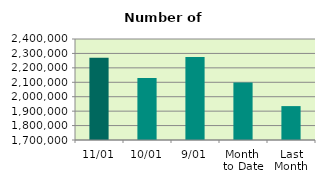
| Category | Series 0 |
|---|---|
| 11/01 | 2269744 |
| 10/01 | 2129860 |
| 9/01 | 2275516 |
| Month 
to Date | 2098296.25 |
| Last
Month | 1934937.048 |